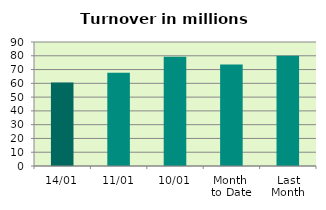
| Category | Series 0 |
|---|---|
| 14/01 | 60.608 |
| 11/01 | 67.693 |
| 10/01 | 79.298 |
| Month 
to Date | 73.676 |
| Last
Month | 79.992 |